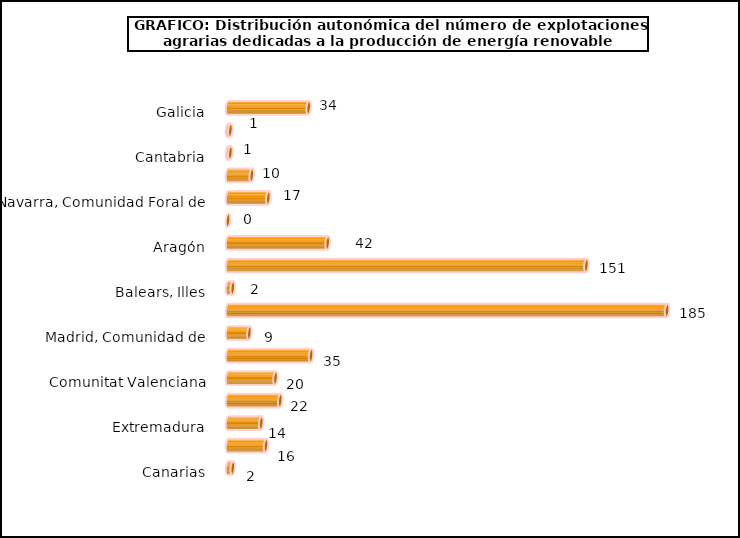
| Category | num. Explotaciones |
|---|---|
| Galicia | 34 |
| Asturias, Principado de | 1 |
| Cantabria | 1 |
| País Vasco | 10 |
| Navarra, Comunidad Foral de | 17 |
| Rioja, La | 0 |
| Aragón | 42 |
| Cataluña | 151 |
| Balears, Illes | 2 |
| Castilla y León | 185 |
| Madrid, Comunidad de | 9 |
| Castilla - La Mancha | 35 |
| Comunitat Valenciana | 20 |
| Murcia, Región de | 22 |
| Extremadura | 14 |
| Andalucía | 16 |
| Canarias | 2 |